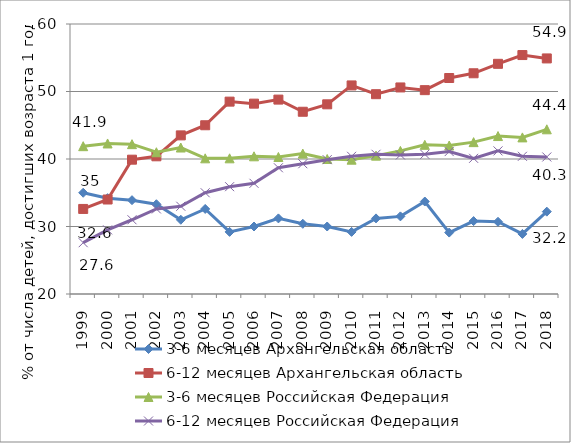
| Category | 3-6 месяцев Архангельская область | 6-12 месяцев Архангельская область | 3-6 месяцев Российская Федерация | 6-12 месяцев Российская Федерация |
|---|---|---|---|---|
| 0 | 35 | 32.6 | 41.9 | 27.6 |
| 1 | 34.2 | 34 | 42.3 | 29.5 |
| 2 | 33.9 | 39.9 | 42.2 | 31 |
| 3 | 33.3 | 40.4 | 41 | 32.6 |
| 4 | 31 | 43.5 | 41.7 | 33 |
| 5 | 32.6 | 45 | 40.1 | 35 |
| 6 | 29.2 | 48.5 | 40.1 | 35.9 |
| 7 | 30 | 48.2 | 40.4 | 36.4 |
| 8 | 31.2 | 48.8 | 40.3 | 38.7 |
| 9 | 30.4 | 47 | 40.8 | 39.3 |
| 10 | 30 | 48.1 | 40 | 39.9 |
| 11 | 29.2 | 50.9 | 39.9 | 40.4 |
| 12 | 31.2 | 49.6 | 40.5 | 40.7 |
| 13 | 31.5 | 50.6 | 41.2 | 40.6 |
| 14 | 33.7 | 50.2 | 42.1 | 40.7 |
| 15 | 29.1 | 52 | 42 | 41.1 |
| 16 | 30.8 | 52.7 | 42.5 | 40.1 |
| 17 | 30.7 | 54.1 | 43.4 | 41.2 |
| 18 | 28.9 | 55.4 | 43.2 | 40.4 |
| 19 | 32.2 | 54.9 | 44.4 | 40.3 |